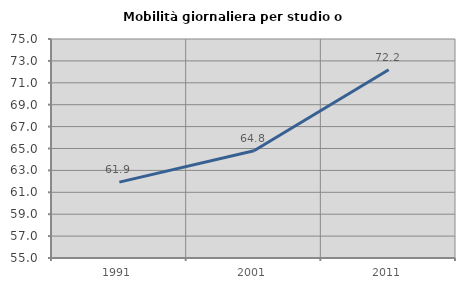
| Category | Mobilità giornaliera per studio o lavoro |
|---|---|
| 1991.0 | 61.931 |
| 2001.0 | 64.79 |
| 2011.0 | 72.189 |